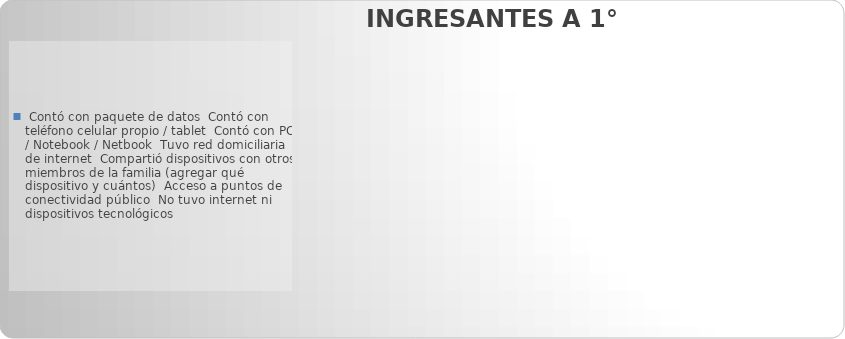
| Category |  Contó con paquete de datos |
|---|---|
|  Contó con paquete de datos | 0 |
|  Contó con teléfono celular propio / tablet | 0 |
|  Contó con PC / Notebook / Netbook | 0 |
|  Tuvo red domiciliaria de internet | 0 |
|  Compartió dispositivos con otros miembros de la familia (agregar qué dispositivo y cuántos) | 0 |
|  Acceso a puntos de conectividad público | 0 |
|  No tuvo internet ni dispositivos tecnológicos | 0 |